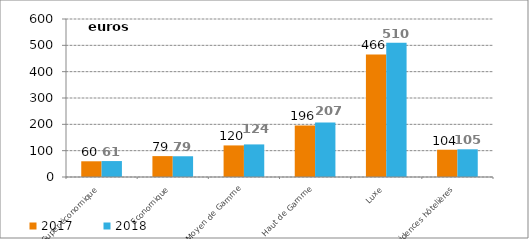
| Category | 2017 | 2018 |
|---|---|---|
| Super-économique | 59.67 | 60.515 |
| Economique | 79.323 | 78.76 |
| Moyen de Gamme | 119.904 | 123.724 |
| Haut de Gamme | 196.034 | 206.771 |
| Luxe | 465.641 | 510.074 |
| Résidences hôtelières | 103.568 | 105.186 |